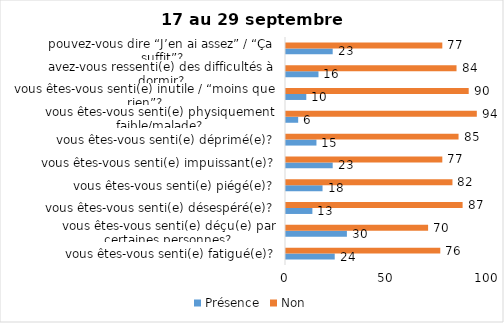
| Category | Présence | Non |
|---|---|---|
| vous êtes-vous senti(e) fatigué(e)? | 24 | 76 |
| vous êtes-vous senti(e) déçu(e) par certaines personnes? | 30 | 70 |
| vous êtes-vous senti(e) désespéré(e)? | 13 | 87 |
| vous êtes-vous senti(e) piégé(e)? | 18 | 82 |
| vous êtes-vous senti(e) impuissant(e)? | 23 | 77 |
| vous êtes-vous senti(e) déprimé(e)? | 15 | 85 |
| vous êtes-vous senti(e) physiquement faible/malade? | 6 | 94 |
| vous êtes-vous senti(e) inutile / “moins que rien”? | 10 | 90 |
| avez-vous ressenti(e) des difficultés à dormir? | 16 | 84 |
| pouvez-vous dire “J’en ai assez” / “Ça suffit”? | 23 | 77 |